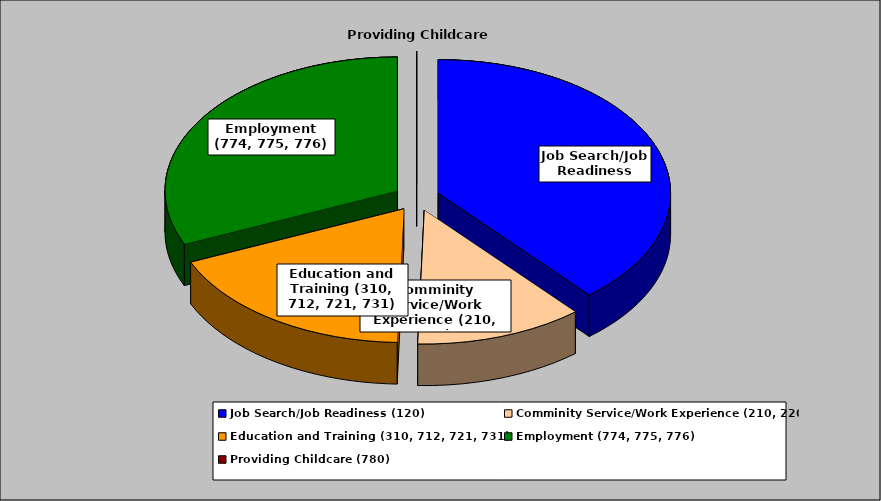
| Category | Series 0 |
|---|---|
| Job Search/Job Readiness (120) | 0.387 |
| Comminity Service/Work Experience (210, 220) | 0.117 |
| Education and Training (310, 712, 721, 731) | 0.18 |
| Employment (774, 775, 776) | 0.315 |
| Providing Childcare (780) | 0 |